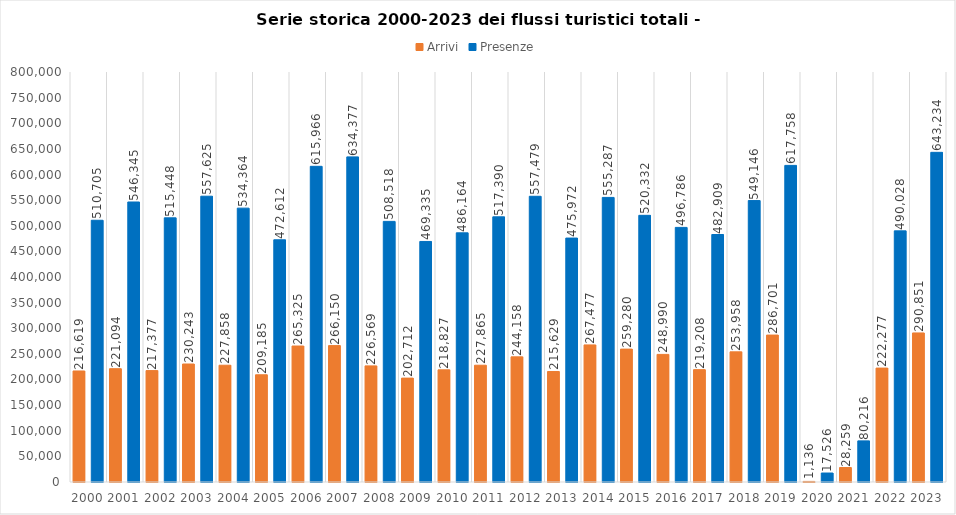
| Category | Arrivi | Presenze |
|---|---|---|
| 2000.0 | 216619 | 510705 |
| 2001.0 | 221094 | 546345 |
| 2002.0 | 217377 | 515448 |
| 2003.0 | 230243 | 557625 |
| 2004.0 | 227858 | 534364 |
| 2005.0 | 209185 | 472612 |
| 2006.0 | 265325 | 615966 |
| 2007.0 | 266150 | 634377 |
| 2008.0 | 226569 | 508518 |
| 2009.0 | 202712 | 469335 |
| 2010.0 | 218827 | 486164 |
| 2011.0 | 227865 | 517390 |
| 2012.0 | 244158 | 557479 |
| 2013.0 | 215629 | 475972 |
| 2014.0 | 267477 | 555287 |
| 2015.0 | 259280 | 520332 |
| 2016.0 | 248990 | 496786 |
| 2017.0 | 219208 | 482909 |
| 2018.0 | 253958 | 549146 |
| 2019.0 | 286701 | 617758 |
| 2020.0 | 1136 | 17526 |
| 2021.0 | 28259 | 80216 |
| 2022.0 | 222277 | 490028 |
| 2023.0 | 290851 | 643234 |